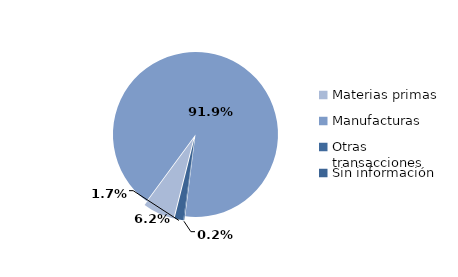
| Category | Series 0 |
|---|---|
| Materias primas | 981.576 |
| Manufacturas | 14533.324 |
| Otras transacciones | 29.135 |
| Sin información | 272.046 |